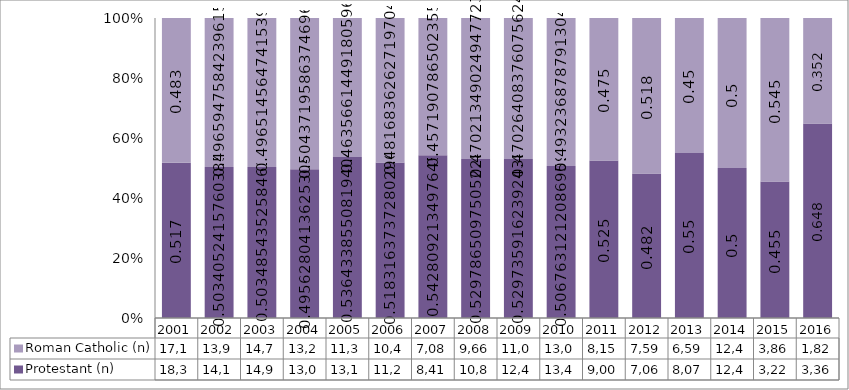
| Category | Protestant (n) | Roman Catholic (n) |
|---|---|---|
| 2001.0 | 18393 | 17169 |
| 2002.0 | 14118 | 13927 |
| 2003.0 | 14951 | 14744 |
| 2004.0 | 13037 | 13267 |
| 2005.0 | 13126 | 11343 |
| 2006.0 | 11206 | 10414 |
| 2007.0 | 8413 | 7086 |
| 2008.0 | 10894 | 9669 |
| 2009.0 | 12497 | 11094 |
| 2010.0 | 13450 | 13091 |
| 2011.0 | 9009 | 8158 |
| 2012.0 | 7061 | 7599 |
| 2013.0 | 8074 | 6599 |
| 2014.0 | 12412 | 12431 |
| 2015.0 | 3228 | 3863 |
| 2016.0 | 3362 | 1824 |